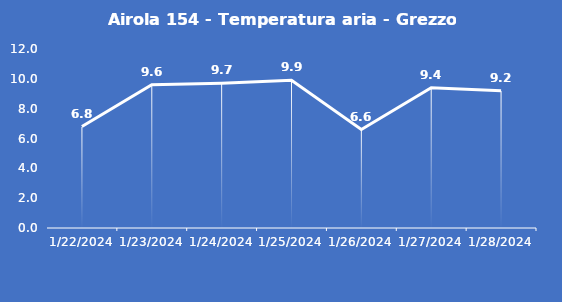
| Category | Airola 154 - Temperatura aria - Grezzo (°C) |
|---|---|
| 1/22/24 | 6.8 |
| 1/23/24 | 9.6 |
| 1/24/24 | 9.7 |
| 1/25/24 | 9.9 |
| 1/26/24 | 6.6 |
| 1/27/24 | 9.4 |
| 1/28/24 | 9.2 |